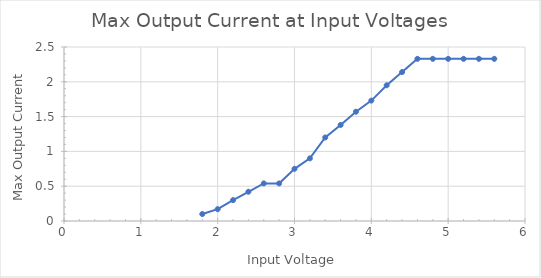
| Category | Series 0 |
|---|---|
| 1.8 | 0.1 |
| 2.0 | 0.17 |
| 2.2 | 0.3 |
| 2.4 | 0.42 |
| 2.6 | 0.54 |
| 2.8 | 0.54 |
| 3.0 | 0.75 |
| 3.2 | 0.9 |
| 3.4 | 1.2 |
| 3.6 | 1.38 |
| 3.8 | 1.57 |
| 4.0 | 1.73 |
| 4.2 | 1.95 |
| 4.4 | 2.14 |
| 4.6 | 2.33 |
| 4.8 | 2.33 |
| 5.0 | 2.33 |
| 5.2 | 2.33 |
| 5.4 | 2.33 |
| 5.6 | 2.33 |